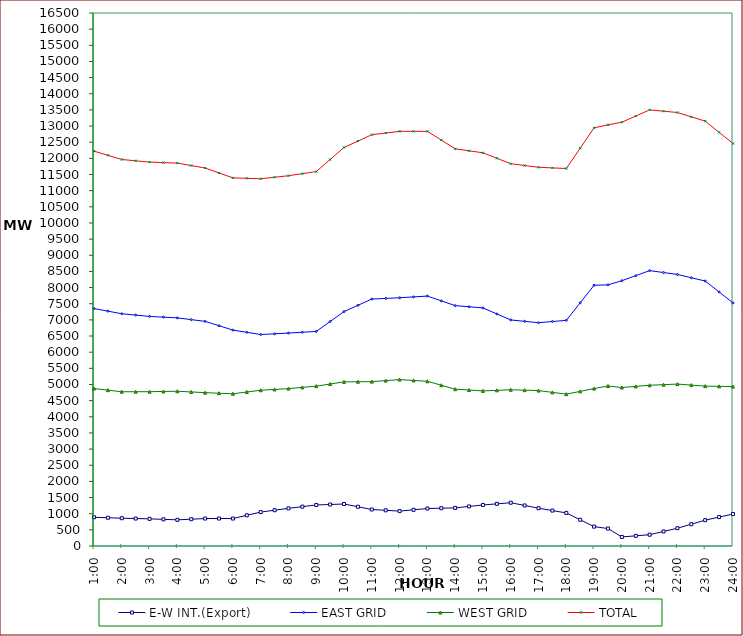
| Category | E-W INT.(Export) | EAST GRID | WEST GRID | TOTAL |
|---|---|---|---|---|
| 1:00 | 890 | 7350 | 4874 | 12224 |
| 1:30 | 875 | 7270 | 4824.5 | 12094.5 |
| 2:00 | 860 | 7190 | 4775 | 11965 |
| 2:30 | 850 | 7148.5 | 4776 | 11924.5 |
| 3:00 | 840 | 7107 | 4777 | 11884 |
| 3:30 | 825 | 7084.5 | 4784 | 11868.5 |
| 4:00 | 810 | 7062 | 4791 | 11853 |
| 4:30 | 830 | 7008 | 4769 | 11777 |
| 5:00 | 850 | 6954 | 4747 | 11701 |
| 5:30 | 850 | 6819 | 4729.5 | 11548.5 |
| 6:00 | 850 | 6684 | 4712 | 11396 |
| 6:30 | 950 | 6615 | 4767 | 11382 |
| 7:00 | 1050 | 6546 | 4822 | 11368 |
| 7:30 | 1108 | 6568.5 | 4847 | 11415.5 |
| 8:00 | 1166 | 6591 | 4872 | 11463 |
| 8:30 | 1218 | 6616.5 | 4910.5 | 11527 |
| 9:00 | 1270 | 6642 | 4949 | 11591 |
| 9:30 | 1285 | 6949.5 | 5015 | 11964.5 |
| 10:00 | 1300 | 7257 | 5081 | 12338 |
| 10:30 | 1215 | 7450.5 | 5085 | 12535.5 |
| 11:00 | 1130 | 7644 | 5089 | 12733 |
| 11:30 | 1105 | 7664.5 | 5120 | 12784.5 |
| 12:00 | 1080 | 7685 | 5151 | 12836 |
| 12:30 | 1120 | 7711 | 5125 | 12836 |
| 13:00 | 1160 | 7737 | 5099 | 12836 |
| 13:30 | 1170 | 7589 | 4977 | 12566 |
| 14:00 | 1180 | 7441 | 4855 | 12296 |
| 14:30 | 1225 | 7405.5 | 4828.5 | 12234 |
| 15:00 | 1270 | 7370 | 4802 | 12172 |
| 15:30 | 1305 | 7184 | 4819 | 12003 |
| 16:00 | 1340 | 6998 | 4836 | 11834 |
| 16:30 | 1255 | 6955.5 | 4823.5 | 11779 |
| 17:00 | 1170 | 6913 | 4811 | 11724 |
| 17:30 | 1097 | 6949 | 4756 | 11705 |
| 18:00 | 1024 | 6985 | 4701 | 11686 |
| 18:30 | 812 | 7528.5 | 4787 | 12315.5 |
| 19:00 | 600 | 8072 | 4873 | 12945 |
| 19:30 | 540 | 8084 | 4954 | 13038 |
| 20:00 | 280 | 8213 | 4906 | 13119 |
| 20:30 | 315 | 8369 | 4941 | 13310 |
| 21:00 | 350 | 8525 | 4976 | 13501 |
| 21:30 | 450 | 8465.5 | 4994.5 | 13460 |
| 22:00 | 550 | 8406 | 5013 | 13419 |
| 22:30 | 675 | 8304.5 | 4981 | 13285.5 |
| 23:00 | 800 | 8203 | 4949 | 13152 |
| 23:30 | 895 | 7864 | 4942 | 12806 |
| 24:00 | 990 | 7525 | 4935 | 12460 |